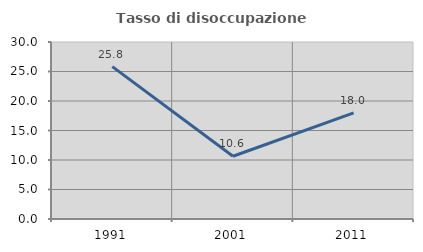
| Category | Tasso di disoccupazione giovanile  |
|---|---|
| 1991.0 | 25.828 |
| 2001.0 | 10.638 |
| 2011.0 | 17.978 |